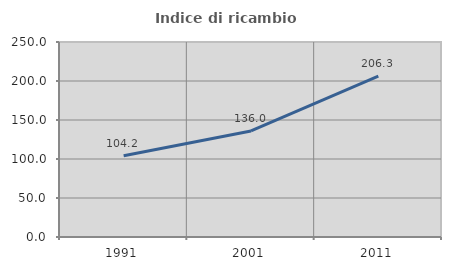
| Category | Indice di ricambio occupazionale  |
|---|---|
| 1991.0 | 104.167 |
| 2001.0 | 136 |
| 2011.0 | 206.25 |